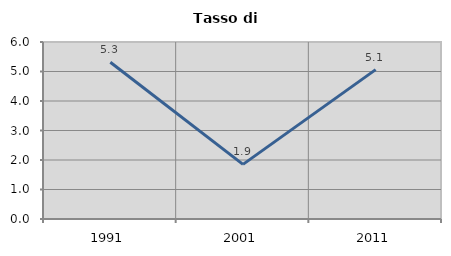
| Category | Tasso di disoccupazione   |
|---|---|
| 1991.0 | 5.314 |
| 2001.0 | 1.852 |
| 2011.0 | 5.064 |